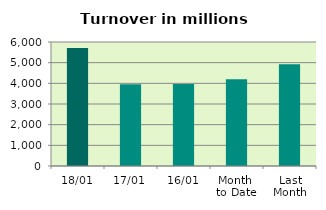
| Category | Series 0 |
|---|---|
| 18/01 | 5713.177 |
| 17/01 | 3952.942 |
| 16/01 | 3969.1 |
| Month 
to Date | 4192.663 |
| Last
Month | 4921.323 |